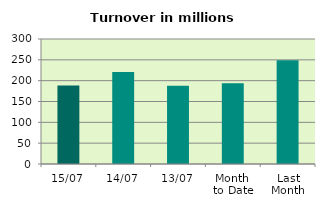
| Category | Series 0 |
|---|---|
| 15/07 | 188.522 |
| 14/07 | 220.929 |
| 13/07 | 187.534 |
| Month 
to Date | 193.894 |
| Last
Month | 248.976 |